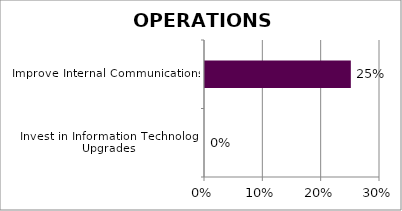
| Category | Series 0 |
|---|---|
| Invest in Information Technology Upgrades | 0 |
| Improve Internal Communications | 0.25 |